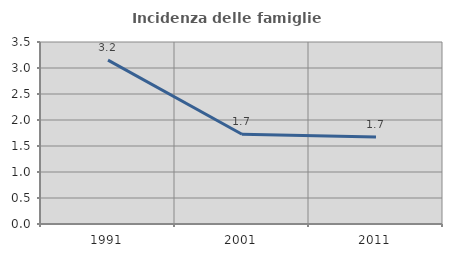
| Category | Incidenza delle famiglie numerose |
|---|---|
| 1991.0 | 3.152 |
| 2001.0 | 1.727 |
| 2011.0 | 1.673 |